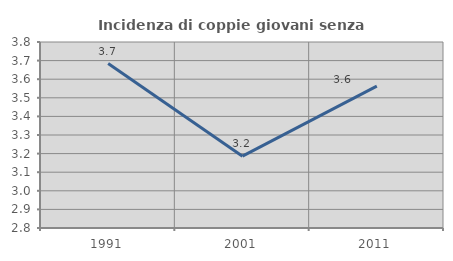
| Category | Incidenza di coppie giovani senza figli |
|---|---|
| 1991.0 | 3.684 |
| 2001.0 | 3.186 |
| 2011.0 | 3.563 |